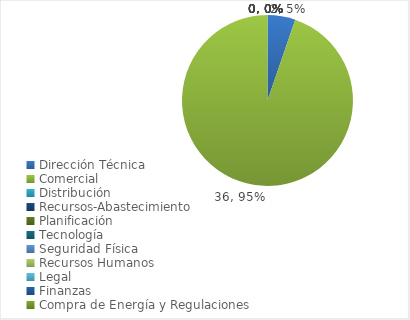
| Category | Series 0 |
|---|---|
| Dirección Técnica | 2 |
| Comercial | 36 |
| Distribución | 0 |
| Recursos-Abastecimiento | 0 |
| Planificación | 0 |
| Tecnología | 0 |
| Seguridad Física | 0 |
| Recursos Humanos | 0 |
| Legal | 0 |
| Finanzas | 0 |
| Compra de Energía y Regulaciones | 0 |